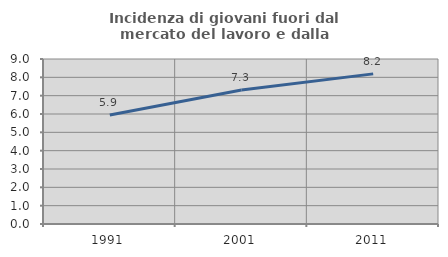
| Category | Incidenza di giovani fuori dal mercato del lavoro e dalla formazione  |
|---|---|
| 1991.0 | 5.949 |
| 2001.0 | 7.304 |
| 2011.0 | 8.188 |